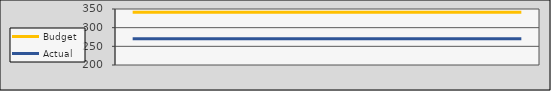
| Category | Budget | Actual |
|---|---|---|
| 2020-07-01 | 341 | 270 |
| 2020-08-01 | 341 | 270 |
| 2020-09-01 | 341 | 270 |
| 2020-10-02 | 341 | 270 |
| 2020-11-02 | 341 | 270 |
| 2020-12-03 | 341 | 270 |
| 2021-01-03 | 341 | 270 |
| 2021-02-03 | 341 | 270 |
| 2021-03-06 | 341 | 270 |
| 2021-04-06 | 341 | 270 |
| 2021-05-07 | 341 | 270 |
| 2021-06-07 | 341 | 270 |